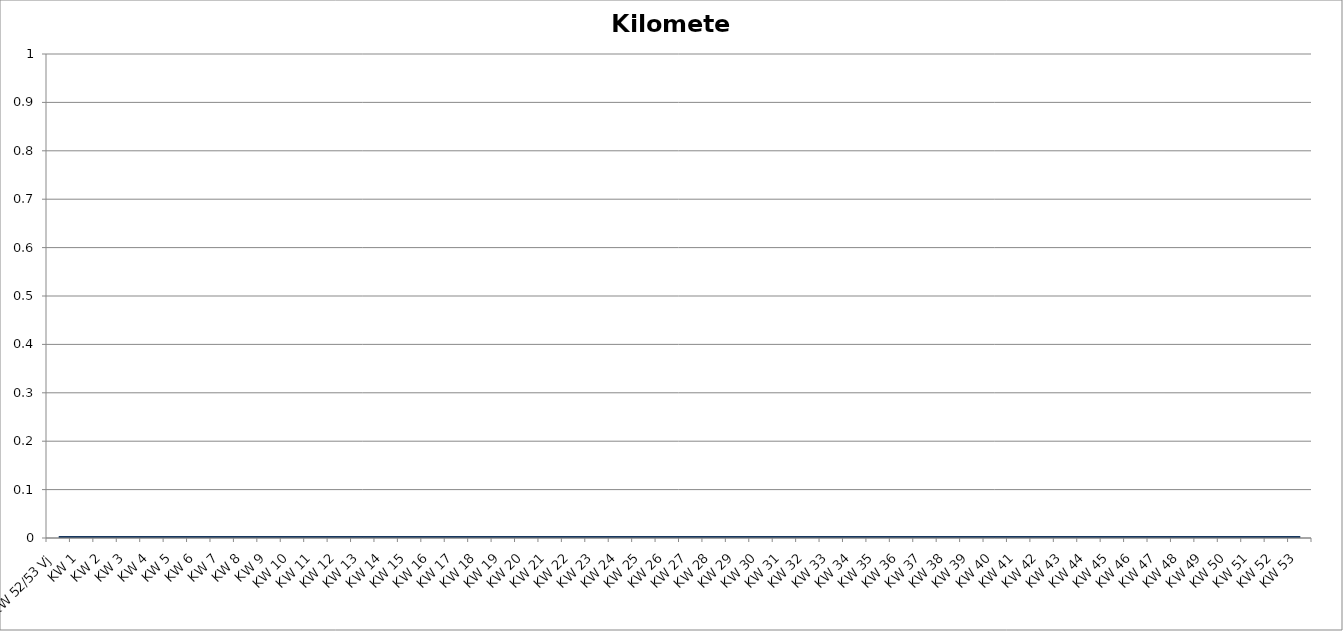
| Category | Kilometer |
|---|---|
| KW 52/53 Vj | 0 |
| KW 1 | 0 |
| KW 2 | 0 |
| KW 3 | 0 |
| KW 4 | 0 |
| KW 5 | 0 |
| KW 6 | 0 |
| KW 7 | 0 |
| KW 8 | 0 |
| KW 9 | 0 |
| KW 10 | 0 |
| KW 11 | 0 |
| KW 12 | 0 |
| KW 13 | 0 |
| KW 14 | 0 |
| KW 15 | 0 |
| KW 16 | 0 |
| KW 17 | 0 |
| KW 18 | 0 |
| KW 19 | 0 |
| KW 20 | 0 |
| KW 21 | 0 |
| KW 22 | 0 |
| KW 23 | 0 |
| KW 24 | 0 |
| KW 25 | 0 |
| KW 26 | 0 |
| KW 27 | 0 |
| KW 28 | 0 |
| KW 29 | 0 |
| KW 30 | 0 |
| KW 31 | 0 |
| KW 32 | 0 |
| KW 33 | 0 |
| KW 34 | 0 |
| KW 35 | 0 |
| KW 36 | 0 |
| KW 37 | 0 |
| KW 38 | 0 |
| KW 39 | 0 |
| KW 40 | 0 |
| KW 41 | 0 |
| KW 42 | 0 |
| KW 43 | 0 |
| KW 44 | 0 |
| KW 45 | 0 |
| KW 46 | 0 |
| KW 47 | 0 |
| KW 48 | 0 |
| KW 49 | 0 |
| KW 50 | 0 |
| KW 51 | 0 |
| KW 52 | 0 |
| KW 53 | 0 |